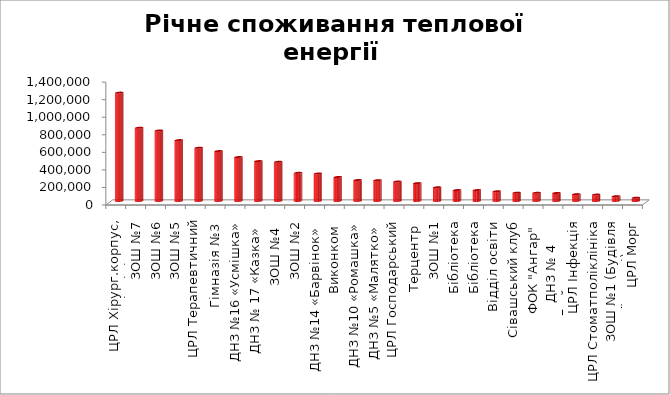
| Category | Річне споживання теплової енергії 
(кВт год/рік) |
|---|---|
| ЦРЛ Хірург.корпус, поліклініка | 1234804 |
| ЗОШ №7 | 834832.801 |
| ЗОШ №6 | 803644.63 |
| ЗОШ №5 | 693723.685 |
| ЦРЛ Терапевтичний корпус | 606723.7 |
| Гімназія №3  | 568920.99 |
| ДНЗ №16 «Усмішка» | 501020.4 |
| ДНЗ № 17 «Казка»  | 454616.7 |
| ЗОШ №4 
 | 446498.78 |
| ЗОШ №2 | 320755.4 |
| ДНЗ №14 «Барвінок»  | 312963.3 |
| Виконком  | 273462 |
| ДНЗ №10 «Ромашка» | 239147.69 |
| ДНЗ №5 «Малятко»  | 236903.1 |
| ЦРЛ Господарський корпус | 222140.3 |
| Терцентр  | 203527.326 |
| ЗОШ №1 | 156074.6 |
| Бібліотека | 124215.378 |
| Бібліотека | 124215.378 |
| Відділ освіти | 110589.67 |
| Сівашський клуб | 94842.65 |
| ФОК "Ангар"  | 93737.8 |
| ДНЗ № 4 «Дюймовочка»
 | 91330.39 |
| ЦРЛ Інфекція | 78026.56 |
| ЦРЛ Стоматполіклініка | 73036.4 |
| ЗОШ №1 (Будівля їдальні) | 55184.35 |
| ЦРЛ Морг | 37499.83 |